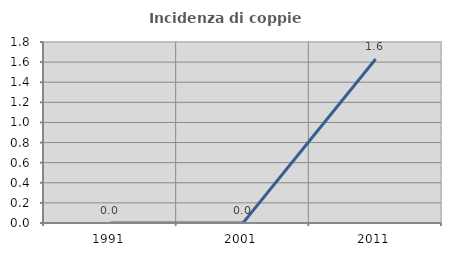
| Category | Incidenza di coppie miste |
|---|---|
| 1991.0 | 0 |
| 2001.0 | 0 |
| 2011.0 | 1.63 |